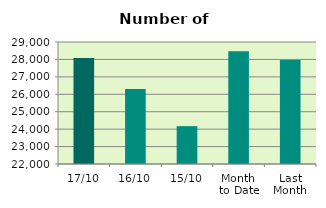
| Category | Series 0 |
|---|---|
| 17/10 | 28078 |
| 16/10 | 26300 |
| 15/10 | 24172 |
| Month 
to Date | 28469.231 |
| Last
Month | 27963.2 |